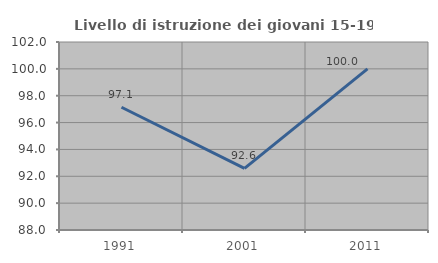
| Category | Livello di istruzione dei giovani 15-19 anni |
|---|---|
| 1991.0 | 97.143 |
| 2001.0 | 92.593 |
| 2011.0 | 100 |